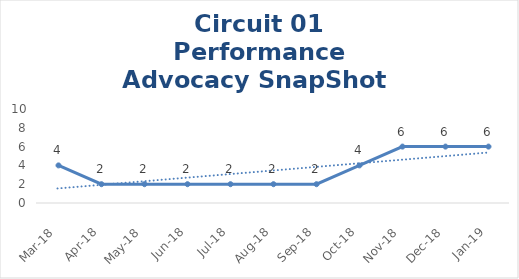
| Category | Circuit 01 |
|---|---|
| Mar-18 | 4 |
| Apr-18 | 2 |
| May-18 | 2 |
| Jun-18 | 2 |
| Jul-18 | 2 |
| Aug-18 | 2 |
| Sep-18 | 2 |
| Oct-18 | 4 |
| Nov-18 | 6 |
| Dec-18 | 6 |
| Jan-19 | 6 |